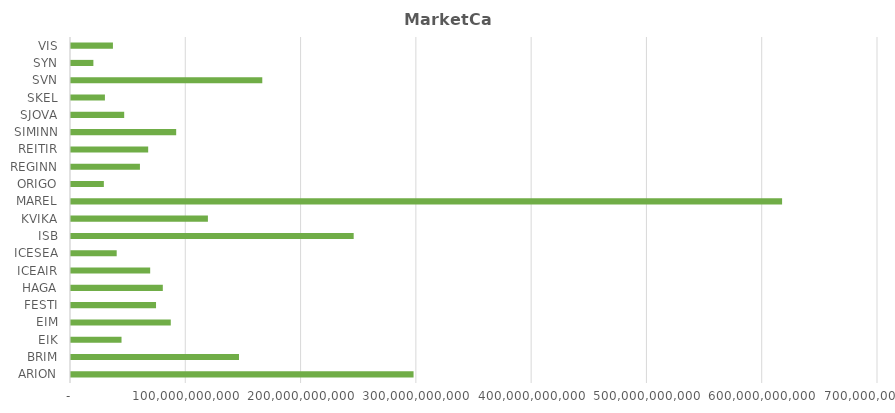
| Category | MARKETCAP |
|---|---|
| ARION | 297140000000 |
| BRIM | 145720480647 |
| EIK | 43825451968 |
| EIM | 86548800000 |
| FESTI | 73758000000 |
| HAGA | 79642068651 |
| ICEAIR | 68680604652.05 |
| ICESEA | 39631407576.6 |
| ISB | 245200000000 |
| KVIKA | 118758957451.2 |
| MAREL | 616806332800 |
| ORIGO | 28492500000 |
| REGINN | 59799388781.6 |
| REITIR | 66948953286 |
| SIMINN | 91234000000 |
| SJOVA | 46141259382.4 |
| SKEL | 29427713364.8 |
| SVN | 165920000000 |
| SYN | 19416916547 |
| VIS | 36373674086.4 |